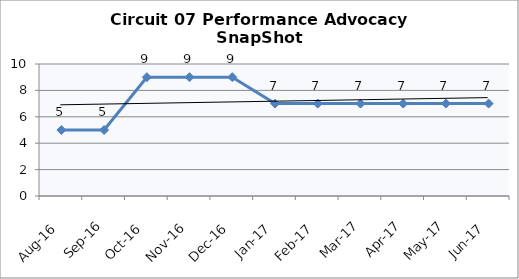
| Category | Circuit 07 |
|---|---|
| Aug-16 | 5 |
| Sep-16 | 5 |
| Oct-16 | 9 |
| Nov-16 | 9 |
| Dec-16 | 9 |
| Jan-17 | 7 |
| Feb-17 | 7 |
| Mar-17 | 7 |
| Apr-17 | 7 |
| May-17 | 7 |
| Jun-17 | 7 |